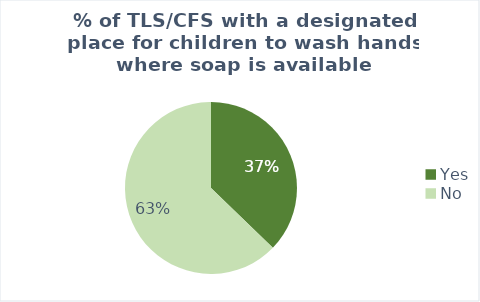
| Category | Average of % of TLS/CFS with a designated place for children to wash hands where soap is available |
|---|---|
| Yes | 0.372 |
| No | 0.628 |